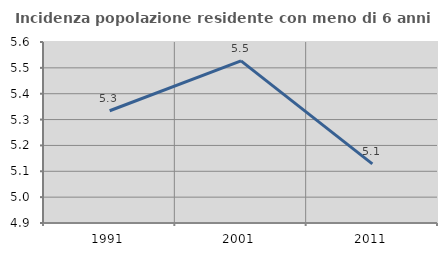
| Category | Incidenza popolazione residente con meno di 6 anni |
|---|---|
| 1991.0 | 5.334 |
| 2001.0 | 5.527 |
| 2011.0 | 5.129 |